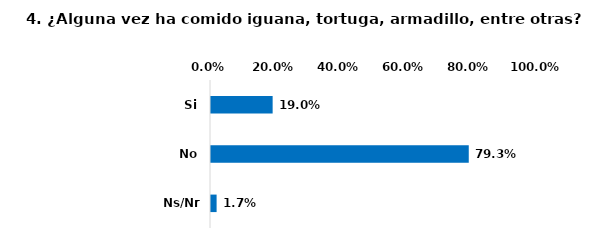
| Category | Series 0 |
|---|---|
| Si | 0.19 |
| No | 0.793 |
| Ns/Nr | 0.017 |